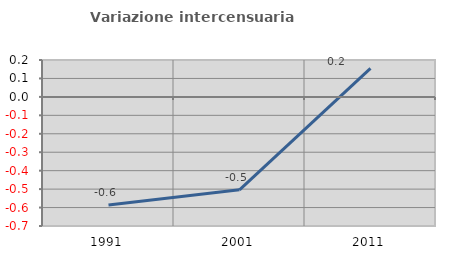
| Category | Variazione intercensuaria annua |
|---|---|
| 1991.0 | -0.586 |
| 2001.0 | -0.504 |
| 2011.0 | 0.155 |